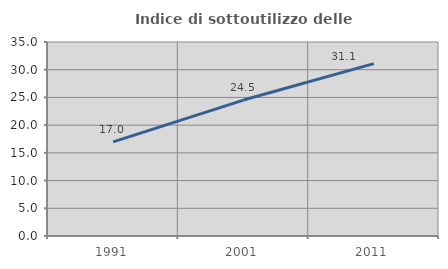
| Category | Indice di sottoutilizzo delle abitazioni  |
|---|---|
| 1991.0 | 16.98 |
| 2001.0 | 24.524 |
| 2011.0 | 31.108 |